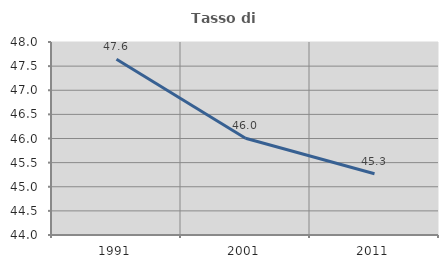
| Category | Tasso di occupazione   |
|---|---|
| 1991.0 | 47.644 |
| 2001.0 | 46.004 |
| 2011.0 | 45.269 |